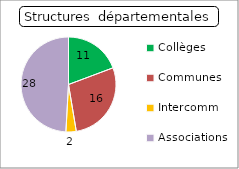
| Category | Series 0 |
|---|---|
| Collèges | 11 |
| Communes | 16 |
| Intercomm | 2 |
| Associations | 28 |